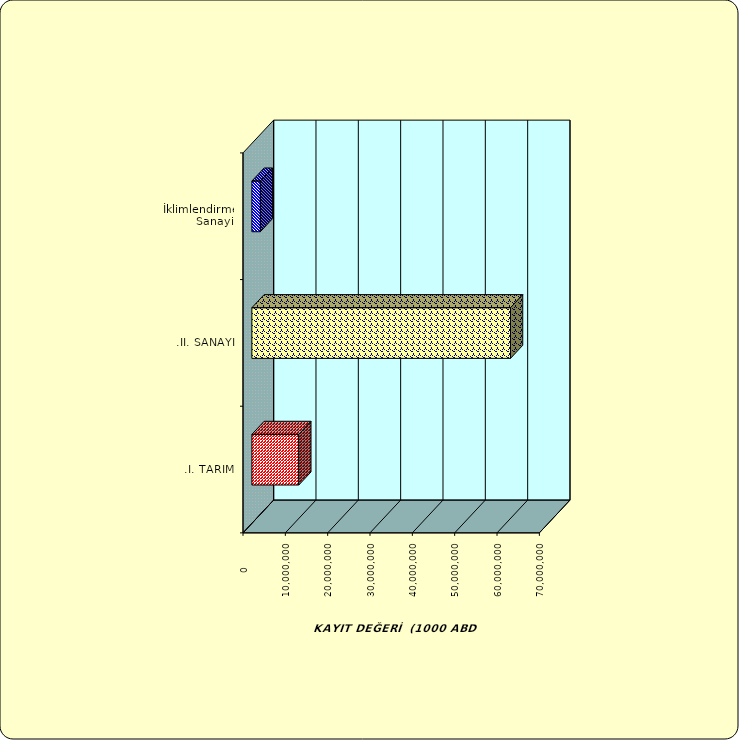
| Category | Series 0 |
|---|---|
| .I. TARIM | 11076833.615 |
| .II. SANAYİ | 61088830.638 |
|  İklimlendirme Sanayii | 2001906.461 |